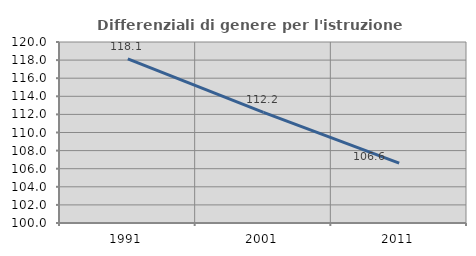
| Category | Differenziali di genere per l'istruzione superiore |
|---|---|
| 1991.0 | 118.139 |
| 2001.0 | 112.231 |
| 2011.0 | 106.621 |